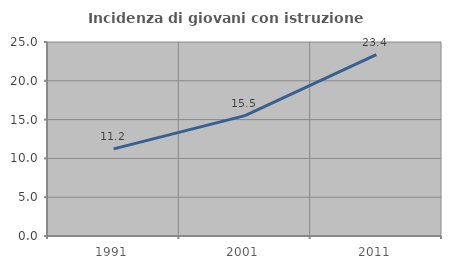
| Category | Incidenza di giovani con istruzione universitaria |
|---|---|
| 1991.0 | 11.224 |
| 2001.0 | 15.517 |
| 2011.0 | 23.377 |